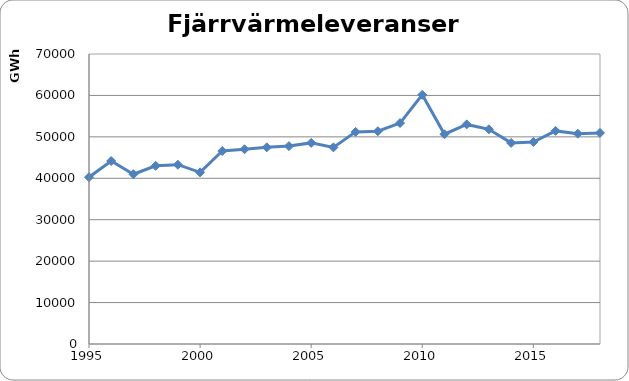
| Category | Series 0 |
|---|---|
| 1995.0 | 40259.516 |
| 1996.0 | 44174 |
| 1997.0 | 40975 |
| 1998.0 | 43012 |
| 1999.0 | 43278 |
| 2000.0 | 41425 |
| 2001.0 | 46580 |
| 2002.0 | 47008 |
| 2003.0 | 47468 |
| 2004.0 | 47768 |
| 2005.0 | 48543 |
| 2006.0 | 47460 |
| 2007.0 | 51202 |
| 2008.0 | 51360 |
| 2009.0 | 53332 |
| 2010.0 | 60151 |
| 2011.0 | 50631 |
| 2012.0 | 53003 |
| 2013.0 | 51824 |
| 2014.0 | 48545 |
| 2015.0 | 48761 |
| 2016.0 | 51440 |
| 2017.0 | 50775 |
| 2018.0 | 50951 |